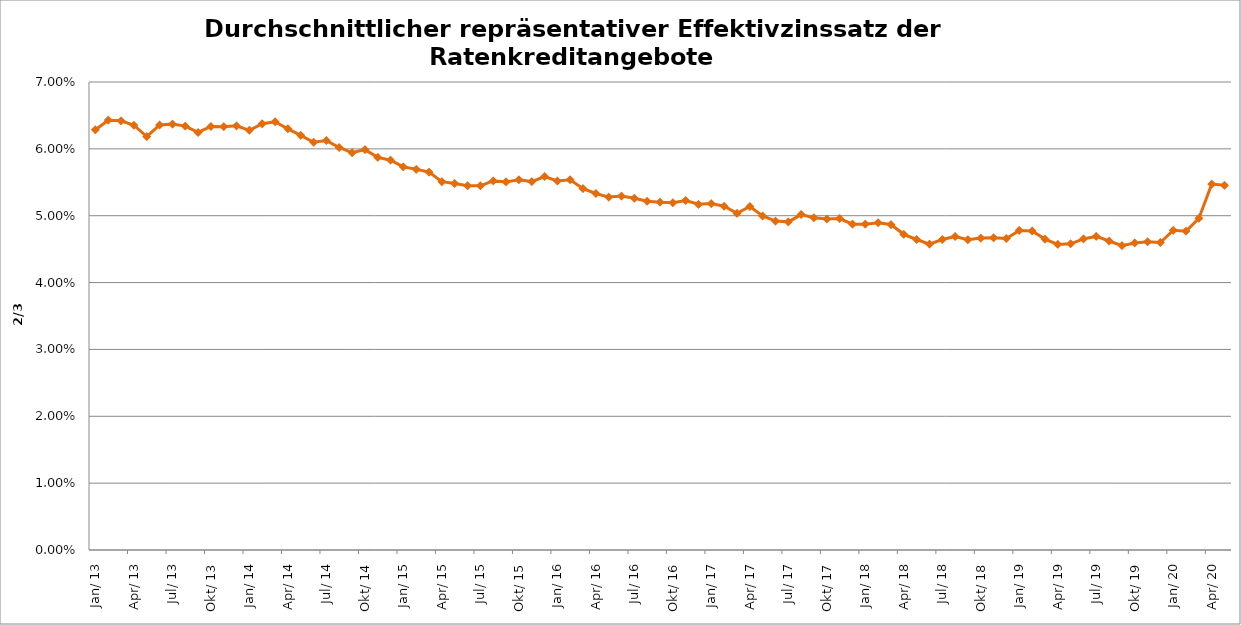
| Category | Series 0 |
|---|---|
| 2013-01-01 | 0.063 |
| 2013-02-01 | 0.064 |
| 2013-03-01 | 0.064 |
| 2013-04-01 | 0.064 |
| 2013-05-01 | 0.062 |
| 2013-06-01 | 0.064 |
| 2013-07-01 | 0.064 |
| 2013-08-01 | 0.063 |
| 2013-09-01 | 0.062 |
| 2013-10-01 | 0.063 |
| 2013-11-01 | 0.063 |
| 2013-12-01 | 0.063 |
| 2014-01-01 | 0.063 |
| 2014-02-01 | 0.064 |
| 2014-03-01 | 0.064 |
| 2014-04-01 | 0.063 |
| 2014-05-01 | 0.062 |
| 2014-06-01 | 0.061 |
| 2014-07-01 | 0.061 |
| 2014-08-01 | 0.06 |
| 2014-09-01 | 0.059 |
| 2014-10-01 | 0.06 |
| 2014-11-01 | 0.059 |
| 2014-12-01 | 0.058 |
| 2015-01-01 | 0.057 |
| 2015-02-01 | 0.057 |
| 2015-03-01 | 0.057 |
| 2015-04-01 | 0.055 |
| 2015-05-01 | 0.055 |
| 2015-06-01 | 0.054 |
| 2015-07-01 | 0.054 |
| 2015-08-01 | 0.055 |
| 2015-09-01 | 0.055 |
| 2015-10-01 | 0.055 |
| 2015-11-01 | 0.055 |
| 2015-12-01 | 0.056 |
| 2016-01-01 | 0.055 |
| 2016-02-01 | 0.055 |
| 2016-03-01 | 0.054 |
| 2016-04-01 | 0.053 |
| 2016-05-01 | 0.053 |
| 2016-06-01 | 0.053 |
| 2016-07-01 | 0.053 |
| 2016-08-01 | 0.052 |
| 2016-09-01 | 0.052 |
| 2016-10-01 | 0.052 |
| 2016-11-01 | 0.052 |
| 2016-12-01 | 0.052 |
| 2017-01-01 | 0.052 |
| 2017-02-01 | 0.051 |
| 2017-03-01 | 0.05 |
| 2017-04-01 | 0.051 |
| 2017-05-01 | 0.05 |
| 2017-06-01 | 0.049 |
| 2017-07-01 | 0.049 |
| 2017-08-01 | 0.05 |
| 2017-09-01 | 0.05 |
| 2017-10-01 | 0.05 |
| 2017-11-01 | 0.05 |
| 2017-12-01 | 0.049 |
| 2018-01-01 | 0.049 |
| 2018-02-01 | 0.049 |
| 2018-03-01 | 0.049 |
| 2018-04-01 | 0.047 |
| 2018-05-01 | 0.046 |
| 2018-06-01 | 0.046 |
| 2018-07-01 | 0.046 |
| 2018-08-01 | 0.047 |
| 2018-09-01 | 0.046 |
| 2018-10-01 | 0.047 |
| 2018-11-01 | 0.047 |
| 2018-12-01 | 0.047 |
| 2019-01-01 | 0.048 |
| 2019-02-01 | 0.048 |
| 2019-03-01 | 0.046 |
| 2019-04-01 | 0.046 |
| 2019-05-01 | 0.046 |
| 2019-06-01 | 0.047 |
| 2019-07-01 | 0.047 |
| 2019-08-01 | 0.046 |
| 2019-09-01 | 0.046 |
| 2019-10-01 | 0.046 |
| 2019-11-01 | 0.046 |
| 2019-12-01 | 0.046 |
| 2020-01-01 | 0.048 |
| 2020-02-01 | 0.048 |
| 2020-03-01 | 0.05 |
| 2020-04-01 | 0.055 |
| 2020-05-01 | 0.055 |